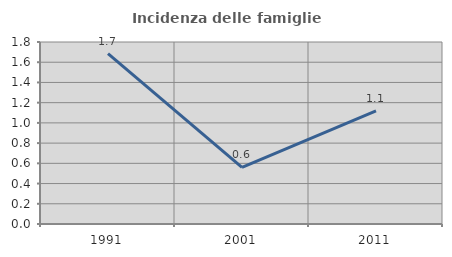
| Category | Incidenza delle famiglie numerose |
|---|---|
| 1991.0 | 1.685 |
| 2001.0 | 0.559 |
| 2011.0 | 1.118 |